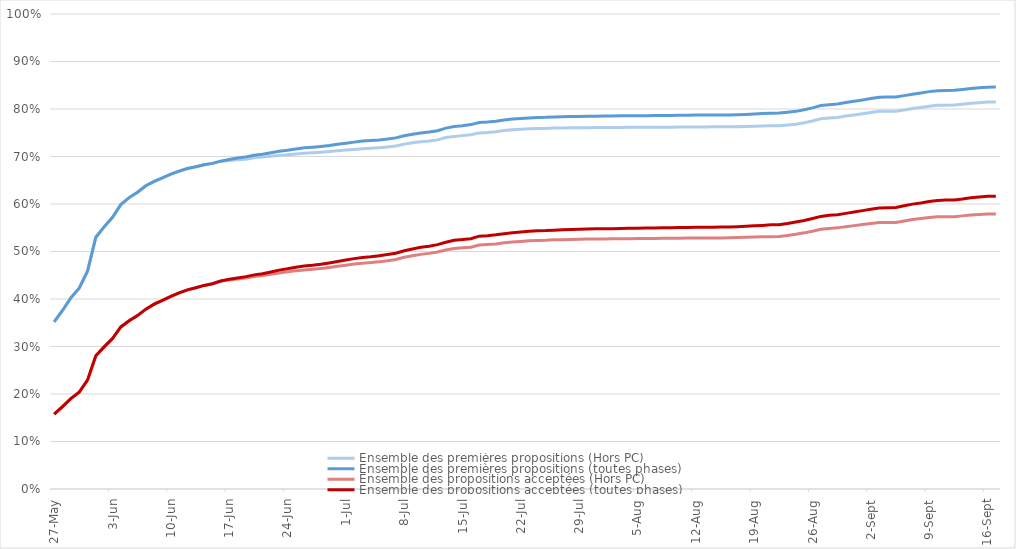
| Category | Ensemble des premières propositions (Hors PC) | Ensemble des premières propositions (toutes phases) | Ensemble des propositions acceptées (Hors PC) | Ensemble des propositions acceptées (toutes phases) |
|---|---|---|---|---|
| 2021-05-27 | 0.352 | 0.352 | 0.158 | 0.158 |
| 2021-05-28 | 0.376 | 0.376 | 0.174 | 0.174 |
| 2021-05-29 | 0.402 | 0.402 | 0.19 | 0.19 |
| 2021-05-30 | 0.423 | 0.423 | 0.204 | 0.204 |
| 2021-05-31 | 0.458 | 0.458 | 0.229 | 0.229 |
| 2021-06-01 | 0.53 | 0.53 | 0.281 | 0.281 |
| 2021-06-02 | 0.552 | 0.552 | 0.299 | 0.299 |
| 2021-06-03 | 0.572 | 0.572 | 0.317 | 0.317 |
| 2021-06-04 | 0.599 | 0.599 | 0.341 | 0.341 |
| 2021-06-05 | 0.613 | 0.613 | 0.354 | 0.354 |
| 2021-06-06 | 0.625 | 0.625 | 0.365 | 0.365 |
| 2021-06-07 | 0.638 | 0.638 | 0.379 | 0.379 |
| 2021-06-08 | 0.648 | 0.648 | 0.389 | 0.389 |
| 2021-06-09 | 0.655 | 0.655 | 0.397 | 0.397 |
| 2021-06-10 | 0.663 | 0.663 | 0.406 | 0.406 |
| 2021-06-11 | 0.669 | 0.669 | 0.413 | 0.413 |
| 2021-06-12 | 0.675 | 0.675 | 0.419 | 0.419 |
| 2021-06-13 | 0.679 | 0.679 | 0.424 | 0.424 |
| 2021-06-14 | 0.683 | 0.683 | 0.429 | 0.429 |
| 2021-06-15 | 0.685 | 0.685 | 0.432 | 0.432 |
| 2021-06-16 | 0.69 | 0.69 | 0.438 | 0.438 |
| 2021-06-17 | 0.692 | 0.694 | 0.44 | 0.442 |
| 2021-06-18 | 0.693 | 0.697 | 0.442 | 0.444 |
| 2021-06-19 | 0.694 | 0.699 | 0.444 | 0.447 |
| 2021-06-20 | 0.697 | 0.703 | 0.447 | 0.451 |
| 2021-06-21 | 0.699 | 0.705 | 0.45 | 0.453 |
| 2021-06-22 | 0.7 | 0.708 | 0.452 | 0.457 |
| 2021-06-23 | 0.702 | 0.711 | 0.455 | 0.461 |
| 2021-06-24 | 0.704 | 0.713 | 0.457 | 0.464 |
| 2021-06-25 | 0.705 | 0.716 | 0.46 | 0.467 |
| 2021-06-26 | 0.707 | 0.718 | 0.461 | 0.469 |
| 2021-06-27 | 0.708 | 0.72 | 0.463 | 0.471 |
| 2021-06-28 | 0.709 | 0.721 | 0.464 | 0.473 |
| 2021-06-29 | 0.71 | 0.723 | 0.466 | 0.476 |
| 2021-06-30 | 0.712 | 0.726 | 0.469 | 0.479 |
| 2021-07-01 | 0.713 | 0.728 | 0.471 | 0.482 |
| 2021-07-02 | 0.715 | 0.73 | 0.474 | 0.485 |
| 2021-07-03 | 0.716 | 0.732 | 0.476 | 0.488 |
| 2021-07-04 | 0.717 | 0.734 | 0.477 | 0.489 |
| 2021-07-05 | 0.719 | 0.735 | 0.479 | 0.491 |
| 2021-07-06 | 0.72 | 0.737 | 0.481 | 0.493 |
| 2021-07-07 | 0.722 | 0.739 | 0.483 | 0.496 |
| 2021-07-08 | 0.726 | 0.744 | 0.488 | 0.502 |
| 2021-07-09 | 0.729 | 0.747 | 0.491 | 0.505 |
| 2021-07-10 | 0.731 | 0.749 | 0.494 | 0.509 |
| 2021-07-11 | 0.732 | 0.751 | 0.496 | 0.511 |
| 2021-07-12 | 0.735 | 0.754 | 0.499 | 0.514 |
| 2021-07-13 | 0.74 | 0.76 | 0.503 | 0.52 |
| 2021-07-14 | 0.742 | 0.763 | 0.506 | 0.524 |
| 2021-07-15 | 0.744 | 0.765 | 0.508 | 0.525 |
| 2021-07-16 | 0.746 | 0.767 | 0.509 | 0.527 |
| 2021-07-17 | 0.75 | 0.772 | 0.514 | 0.532 |
| 2021-07-18 | 0.751 | 0.773 | 0.515 | 0.533 |
| 2021-07-19 | 0.752 | 0.774 | 0.516 | 0.535 |
| 2021-07-20 | 0.755 | 0.777 | 0.518 | 0.538 |
| 2021-07-21 | 0.756 | 0.779 | 0.52 | 0.539 |
| 2021-07-22 | 0.757 | 0.78 | 0.521 | 0.541 |
| 2021-07-23 | 0.758 | 0.781 | 0.522 | 0.542 |
| 2021-07-24 | 0.759 | 0.782 | 0.523 | 0.543 |
| 2021-07-25 | 0.759 | 0.782 | 0.524 | 0.544 |
| 2021-07-26 | 0.76 | 0.783 | 0.525 | 0.545 |
| 2021-07-27 | 0.76 | 0.784 | 0.525 | 0.546 |
| 2021-07-28 | 0.76 | 0.784 | 0.525 | 0.546 |
| 2021-07-29 | 0.761 | 0.784 | 0.526 | 0.547 |
| 2021-07-30 | 0.761 | 0.785 | 0.526 | 0.547 |
| 2021-07-31 | 0.761 | 0.785 | 0.526 | 0.548 |
| 2021-08-01 | 0.761 | 0.785 | 0.527 | 0.548 |
| 2021-08-02 | 0.761 | 0.785 | 0.527 | 0.548 |
| 2021-08-03 | 0.761 | 0.786 | 0.527 | 0.549 |
| 2021-08-04 | 0.761 | 0.786 | 0.527 | 0.549 |
| 2021-08-05 | 0.761 | 0.786 | 0.527 | 0.549 |
| 2021-08-06 | 0.761 | 0.786 | 0.527 | 0.549 |
| 2021-08-07 | 0.762 | 0.786 | 0.528 | 0.55 |
| 2021-08-08 | 0.762 | 0.786 | 0.528 | 0.55 |
| 2021-08-09 | 0.762 | 0.786 | 0.528 | 0.55 |
| 2021-08-10 | 0.762 | 0.787 | 0.528 | 0.55 |
| 2021-08-11 | 0.762 | 0.787 | 0.528 | 0.551 |
| 2021-08-12 | 0.762 | 0.787 | 0.528 | 0.551 |
| 2021-08-13 | 0.762 | 0.787 | 0.528 | 0.551 |
| 2021-08-14 | 0.762 | 0.787 | 0.529 | 0.551 |
| 2021-08-15 | 0.762 | 0.787 | 0.529 | 0.551 |
| 2021-08-16 | 0.763 | 0.788 | 0.529 | 0.552 |
| 2021-08-17 | 0.763 | 0.788 | 0.529 | 0.552 |
| 2021-08-18 | 0.763 | 0.789 | 0.53 | 0.553 |
| 2021-08-19 | 0.764 | 0.789 | 0.53 | 0.554 |
| 2021-08-20 | 0.764 | 0.79 | 0.531 | 0.555 |
| 2021-08-21 | 0.765 | 0.791 | 0.531 | 0.556 |
| 2021-08-22 | 0.765 | 0.791 | 0.531 | 0.556 |
| 2021-08-23 | 0.767 | 0.793 | 0.534 | 0.559 |
| 2021-08-24 | 0.768 | 0.795 | 0.536 | 0.562 |
| 2021-08-25 | 0.771 | 0.798 | 0.539 | 0.565 |
| 2021-08-26 | 0.775 | 0.802 | 0.543 | 0.569 |
| 2021-08-27 | 0.779 | 0.807 | 0.547 | 0.574 |
| 2021-08-28 | 0.781 | 0.809 | 0.549 | 0.576 |
| 2021-08-29 | 0.782 | 0.81 | 0.55 | 0.578 |
| 2021-08-30 | 0.785 | 0.814 | 0.552 | 0.58 |
| 2021-08-31 | 0.787 | 0.816 | 0.554 | 0.583 |
| 2021-09-01 | 0.79 | 0.819 | 0.557 | 0.586 |
| 2021-09-02 | 0.793 | 0.822 | 0.559 | 0.589 |
| 2021-09-03 | 0.795 | 0.825 | 0.561 | 0.592 |
| 2021-09-04 | 0.795 | 0.825 | 0.561 | 0.592 |
| 2021-09-05 | 0.795 | 0.825 | 0.561 | 0.593 |
| 2021-09-06 | 0.798 | 0.828 | 0.564 | 0.596 |
| 2021-09-07 | 0.801 | 0.831 | 0.567 | 0.6 |
| 2021-09-08 | 0.803 | 0.834 | 0.569 | 0.602 |
| 2021-09-09 | 0.806 | 0.837 | 0.572 | 0.605 |
| 2021-09-10 | 0.808 | 0.839 | 0.573 | 0.608 |
| 2021-09-11 | 0.808 | 0.839 | 0.573 | 0.608 |
| 2021-09-12 | 0.808 | 0.839 | 0.573 | 0.609 |
| 2021-09-13 | 0.81 | 0.841 | 0.575 | 0.61 |
| 2021-09-14 | 0.812 | 0.843 | 0.577 | 0.613 |
| 2021-09-15 | 0.813 | 0.845 | 0.578 | 0.615 |
| 2021-09-16 | 0.815 | 0.846 | 0.579 | 0.616 |
| 2021-09-17 | 0.815 | 0.846 | 0.579 | 0.616 |